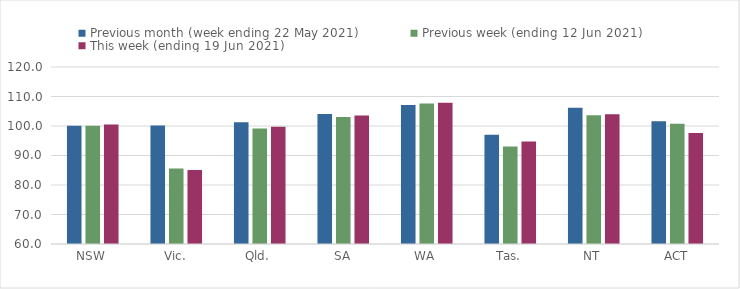
| Category | Previous month (week ending 22 May 2021) | Previous week (ending 12 Jun 2021) | This week (ending 19 Jun 2021) |
|---|---|---|---|
| NSW | 100.09 | 100.1 | 100.55 |
| Vic. | 100.19 | 85.6 | 85.06 |
| Qld. | 101.3 | 99.14 | 99.72 |
| SA | 104.06 | 103.01 | 103.55 |
| WA | 107.14 | 107.66 | 107.85 |
| Tas. | 97.06 | 93.08 | 94.76 |
| NT | 106.15 | 103.63 | 103.95 |
| ACT | 101.59 | 100.74 | 97.62 |